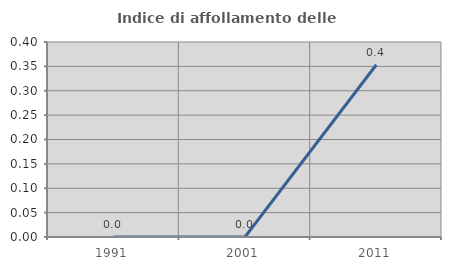
| Category | Indice di affollamento delle abitazioni  |
|---|---|
| 1991.0 | 0 |
| 2001.0 | 0 |
| 2011.0 | 0.353 |